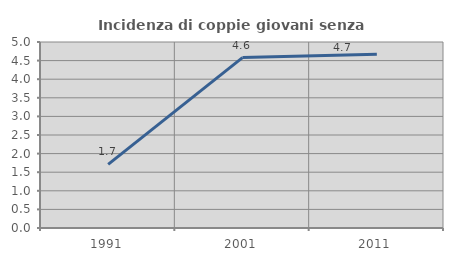
| Category | Incidenza di coppie giovani senza figli |
|---|---|
| 1991.0 | 1.709 |
| 2001.0 | 4.58 |
| 2011.0 | 4.673 |